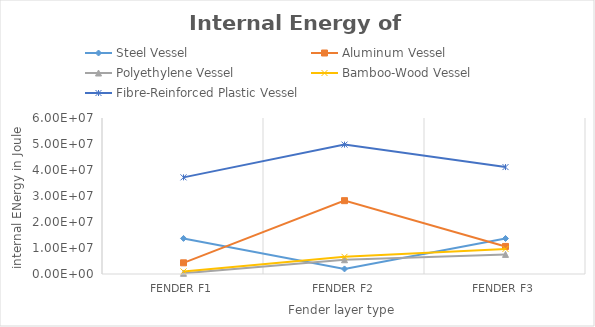
| Category | Steel Vessel | Aluminum Vessel | Polyethylene Vessel | Bamboo-Wood Vessel | Fibre-Reinforced Plastic Vessel |
|---|---|---|---|---|---|
| Fender F1 | 13685000 | 4297900 | 273120 | 986830 | 37171000 |
| Fender F2 | 1949400 | 28207000 | 5483400 | 6601400 | 49770000 |
| Fender F3 | 13659000 | 10600000 | 7545600 | 9645700 | 41128000 |